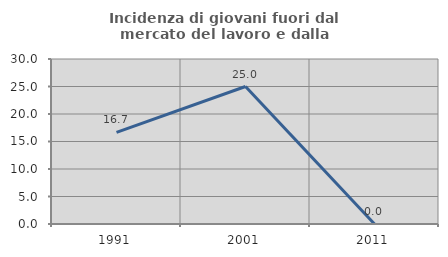
| Category | Incidenza di giovani fuori dal mercato del lavoro e dalla formazione  |
|---|---|
| 1991.0 | 16.667 |
| 2001.0 | 25 |
| 2011.0 | 0 |